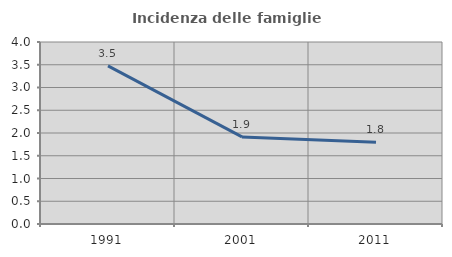
| Category | Incidenza delle famiglie numerose |
|---|---|
| 1991.0 | 3.476 |
| 2001.0 | 1.913 |
| 2011.0 | 1.798 |